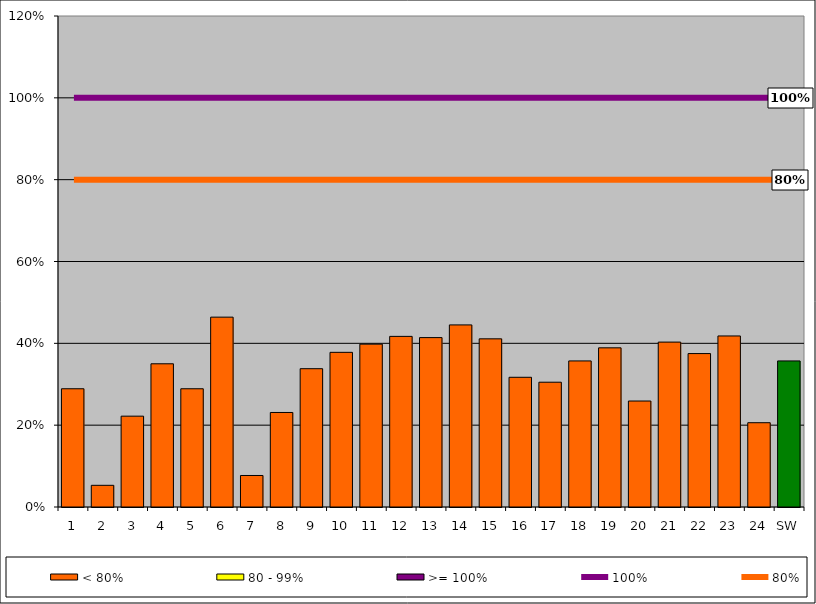
| Category | < 80% | 80 - 99% | >= 100% |
|---|---|---|---|
| 1 | 0.289 | 0 | 0 |
| 2 | 0.053 | 0 | 0 |
| 3 | 0.222 | 0 | 0 |
| 4 | 0.35 | 0 | 0 |
| 5 | 0.289 | 0 | 0 |
| 6 | 0.464 | 0 | 0 |
| 7 | 0.077 | 0 | 0 |
| 8 | 0.231 | 0 | 0 |
| 9 | 0.338 | 0 | 0 |
| 10 | 0.378 | 0 | 0 |
| 11 | 0.398 | 0 | 0 |
| 12 | 0.417 | 0 | 0 |
| 13 | 0.414 | 0 | 0 |
| 14 | 0.445 | 0 | 0 |
| 15 | 0.411 | 0 | 0 |
| 16 | 0.317 | 0 | 0 |
| 17 | 0.305 | 0 | 0 |
| 18 | 0.357 | 0 | 0 |
| 19 | 0.389 | 0 | 0 |
| 20 | 0.259 | 0 | 0 |
| 21 | 0.403 | 0 | 0 |
| 22 | 0.375 | 0 | 0 |
| 23 | 0.418 | 0 | 0 |
| 24 | 0.206 | 0 | 0 |
| SW | 0.357 | 0 | 0 |